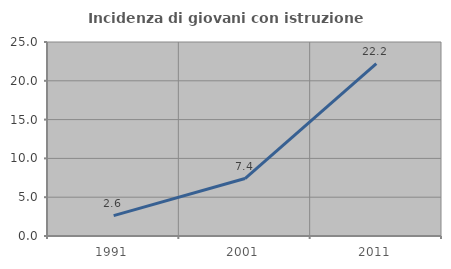
| Category | Incidenza di giovani con istruzione universitaria |
|---|---|
| 1991.0 | 2.632 |
| 2001.0 | 7.407 |
| 2011.0 | 22.222 |